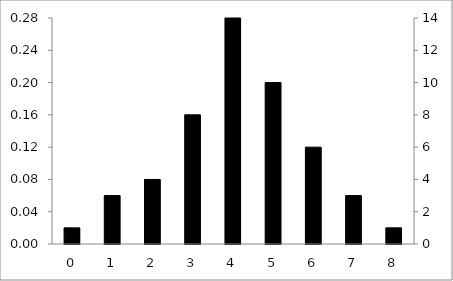
| Category | 0,02 0,06 0,08 0,16 0,28 0,20 0,12 0,06 0,02 |
|---|---|
| 0.0 | 0.02 |
| 1.0 | 0.06 |
| 2.0 | 0.08 |
| 3.0 | 0.16 |
| 4.0 | 0.28 |
| 5.0 | 0.2 |
| 6.0 | 0.12 |
| 7.0 | 0.06 |
| 8.0 | 0.02 |